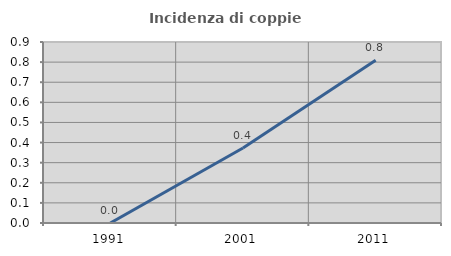
| Category | Incidenza di coppie miste |
|---|---|
| 1991.0 | 0 |
| 2001.0 | 0.373 |
| 2011.0 | 0.81 |